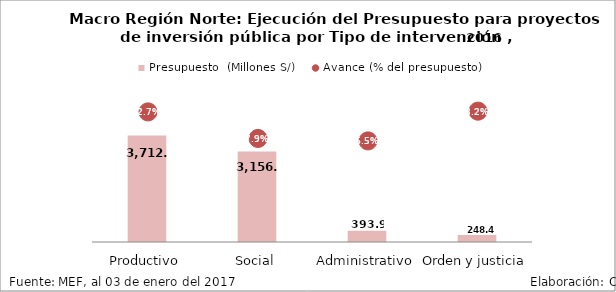
| Category | Presupuesto  (Millones S/) |
|---|---|
| Productivo | 3712.538 |
| Social | 3156.925 |
| Administrativo | 393.938 |
| Orden y justicia | 248.43 |